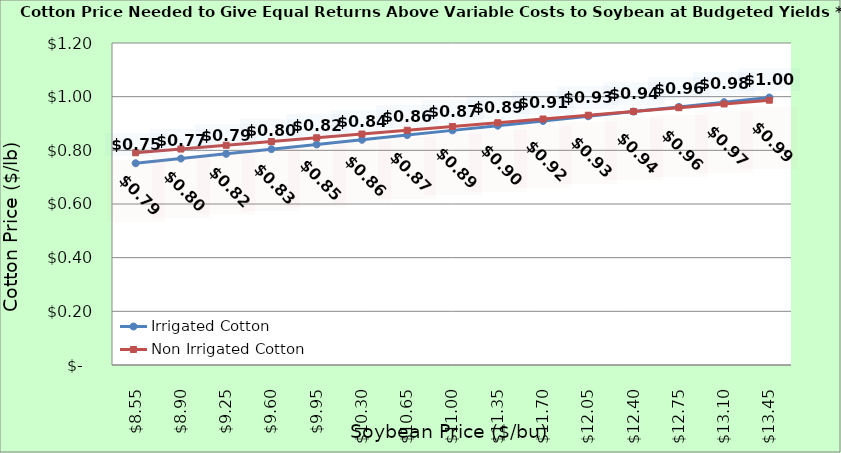
| Category | Irrigated Cotton | Non Irrigated Cotton |
|---|---|---|
| 8.550000000000002 | 0.752 | 0.791 |
| 8.900000000000002 | 0.769 | 0.805 |
| 9.250000000000002 | 0.787 | 0.819 |
| 9.600000000000001 | 0.804 | 0.833 |
| 9.950000000000001 | 0.822 | 0.847 |
| 10.3 | 0.839 | 0.861 |
| 10.65 | 0.857 | 0.875 |
| 11.0 | 0.874 | 0.889 |
| 11.35 | 0.892 | 0.903 |
| 11.7 | 0.909 | 0.917 |
| 12.049999999999999 | 0.927 | 0.931 |
| 12.399999999999999 | 0.944 | 0.945 |
| 12.749999999999998 | 0.962 | 0.959 |
| 13.099999999999998 | 0.979 | 0.973 |
| 13.449999999999998 | 0.997 | 0.987 |